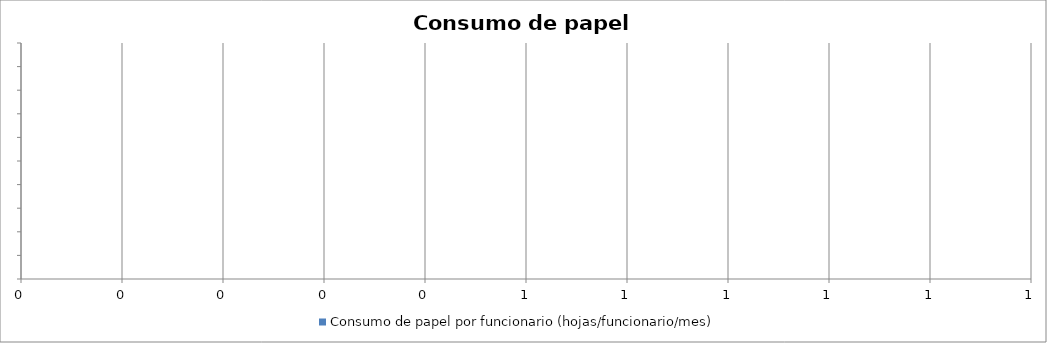
| Category | Consumo de papel por funcionario (hojas/funcionario/mes) |
|---|---|
| 0 | 0 |
| 1 | 0 |
| 2 | 0 |
| 3 | 0 |
| 4 | 0 |
| 5 | 0 |
| 6 | 0 |
| 7 | 0 |
| 8 | 0 |
| 9 | 0 |